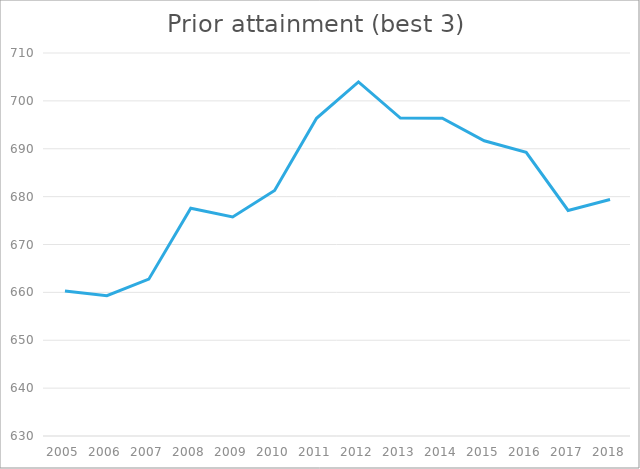
| Category | Mean points score, best 3 |
|---|---|
| 2005.0 | 660.273 |
| 2006.0 | 659.298 |
| 2007.0 | 662.759 |
| 2008.0 | 677.566 |
| 2009.0 | 675.738 |
| 2010.0 | 681.27 |
| 2011.0 | 696.367 |
| 2012.0 | 703.952 |
| 2013.0 | 696.407 |
| 2014.0 | 696.391 |
| 2015.0 | 691.669 |
| 2016.0 | 689.238 |
| 2017.0 | 677.11 |
| 2018.0 | 679.388 |